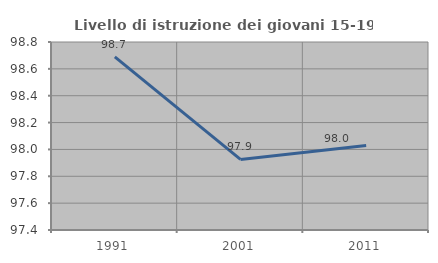
| Category | Livello di istruzione dei giovani 15-19 anni |
|---|---|
| 1991.0 | 98.689 |
| 2001.0 | 97.926 |
| 2011.0 | 98.03 |